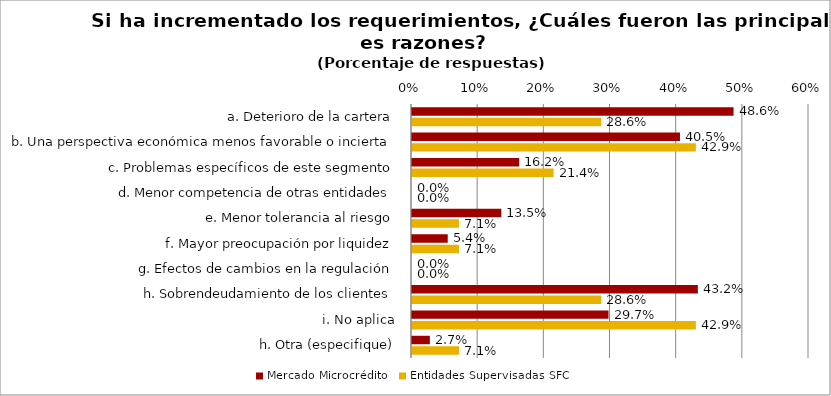
| Category | Mercado Microcrédito | Entidades Supervisadas SFC |
|---|---|---|
| a. Deterioro de la cartera | 0.486 | 0.286 |
| b. Una perspectiva económica menos favorable o incierta | 0.405 | 0.429 |
| c. Problemas específicos de este segmento | 0.162 | 0.214 |
| d. Menor competencia de otras entidades | 0 | 0 |
| e. Menor tolerancia al riesgo | 0.135 | 0.071 |
| f. Mayor preocupación por liquidez | 0.054 | 0.071 |
| g. Efectos de cambios en la regulación | 0 | 0 |
| h. Sobrendeudamiento de los clientes | 0.432 | 0.286 |
| i. No aplica | 0.297 | 0.429 |
| h. Otra (especifique) | 0.027 | 0.071 |